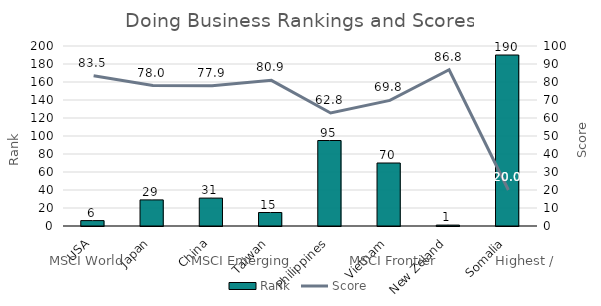
| Category | Rank |
|---|---|
| USA | 6 |
| Japan | 29 |
| China | 31 |
| Taiwan | 15 |
| Philippines | 95 |
| Vietnam | 70 |
| New Zeland | 1 |
| Somalia | 190 |